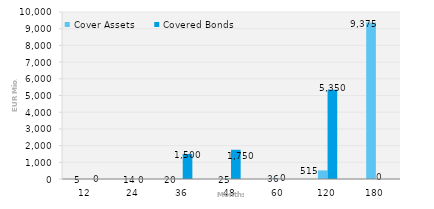
| Category | Cover Assets | Covered Bonds |
|---|---|---|
| 12.0 | 4.747 | 0 |
| 24.0 | 13.598 | 0 |
| 36.0 | 19.83 | 1500 |
| 48.0 | 25.291 | 1750 |
| 60.0 | 35.782 | 0 |
| 120.0 | 515.343 | 5350 |
| 180.0 | 9375.129 | 0 |